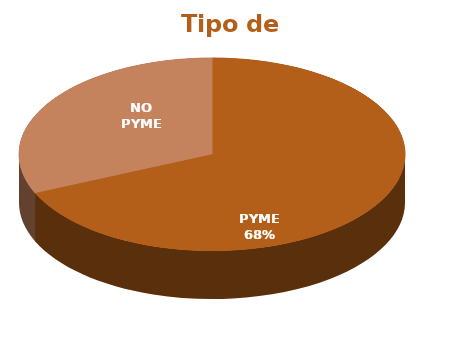
| Category | Series 0 |
|---|---|
| PYME | 13 |
| NO PYME | 6 |